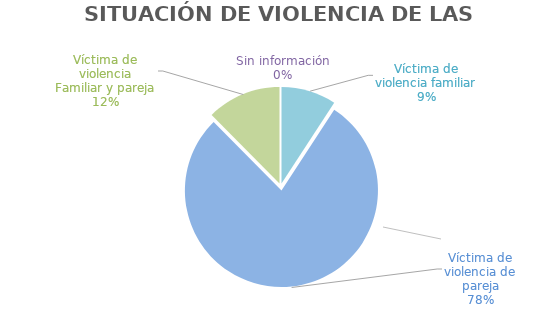
| Category | Series 0 |
|---|---|
| Víctima de violencia familiar | 0.092 |
| Víctima de violencia de pareja | 0.784 |
| Víctima de violencia Familiar y pareja | 0.124 |
| Sin información | 0 |